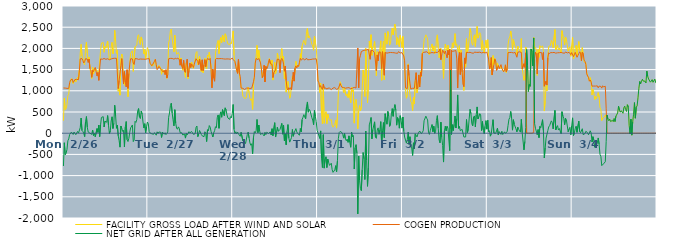
| Category | FACILITY GROSS LOAD AFTER WIND AND SOLAR | COGEN PRODUCTION | NET GRID AFTER ALL GENERATION |
|---|---|---|---|
|  Mon  2/26 | 293 | 1067 | -774 |
|  Mon  2/26 | 829 | 1054 | -225 |
|  Mon  2/26 | 553 | 1064 | -511 |
|  Mon  2/26 | 583 | 1058 | -475 |
|  Mon  2/26 | 675 | 1058 | -383 |
|  Mon  2/26 | 886 | 1065 | -179 |
|  Mon  2/26 | 921 | 1055 | -134 |
|  Mon  2/26 | 1161 | 1193 | -32 |
|  Mon  2/26 | 1233 | 1253 | -20 |
|  Mon  2/26 | 1290 | 1265 | 25 |
|  Mon  2/26 | 1291 | 1274 | 17 |
|  Mon  2/26 | 1166 | 1196 | -30 |
|  Mon  2/26 | 1221 | 1194 | 27 |
|  Mon  2/26 | 1271 | 1263 | 8 |
|  Mon  2/26 | 1206 | 1241 | -35 |
|  Mon  2/26 | 1256 | 1270 | -14 |
|  Mon  2/26 | 1322 | 1280 | 42 |
|  Mon  2/26 | 1264 | 1262 | 2 |
|  Mon  2/26 | 1491 | 1471 | 20 |
|  Mon  2/26 | 1885 | 1754 | 131 |
|  Mon  2/26 | 2095 | 1737 | 358 |
|  Mon  2/26 | 1822 | 1759 | 63 |
|  Mon  2/26 | 1752 | 1713 | 39 |
|  Mon  2/26 | 1651 | 1657 | -6 |
|  Mon  2/26 | 1611 | 1692 | -81 |
|  Mon  2/26 | 2029 | 1757 | 272 |
|  Mon  2/26 | 2147 | 1754 | 393 |
|  Mon  2/26 | 1886 | 1748 | 138 |
|  Mon  2/26 | 1697 | 1670 | 27 |
|  Mon  2/26 | 1792 | 1748 | 44 |
|  Mon  2/26 | 1526 | 1526 | 0 |
|  Mon  2/26 | 1504 | 1499 | 5 |
|  Mon  2/26 | 1290 | 1318 | -28 |
|  Mon  2/26 | 1556 | 1482 | 74 |
|  Mon  2/26 | 1395 | 1451 | -56 |
|  Mon  2/26 | 1519 | 1522 | -3 |
|  Mon  2/26 | 1464 | 1550 | -86 |
|  Mon  2/26 | 1508 | 1571 | -63 |
|  Mon  2/26 | 1461 | 1352 | 109 |
|  Mon  2/26 | 1450 | 1431 | 19 |
|  Mon  2/26 | 1440 | 1247 | 193 |
|  Mon  2/26 | 1450 | 1530 | -80 |
|  Mon  2/26 | 1949 | 1752 | 197 |
|  Mon  2/26 | 2126 | 1754 | 372 |
|  Mon  2/26 | 2113 | 1744 | 369 |
|  Mon  2/26 | 2137 | 1747 | 390 |
|  Mon  2/26 | 1909 | 1762 | 147 |
|  Mon  2/26 | 2046 | 1763 | 283 |
|  Mon  2/26 | 2004 | 1743 | 261 |
|  Mon  2/26 | 2017 | 1758 | 259 |
|  Mon  2/26 | 2172 | 1756 | 416 |
|  Mon  2/26 | 1948 | 1768 | 180 |
|  Mon  2/26 | 1726 | 1733 | -7 |
|  Mon  2/26 | 1775 | 1722 | 53 |
|  Mon  2/26 | 2039 | 1751 | 288 |
|  Mon  2/26 | 2142 | 1755 | 387 |
|  Mon  2/26 | 1875 | 1764 | 111 |
|  Mon  2/26 | 1990 | 1756 | 234 |
|  Mon  2/26 | 2426 | 1767 | 659 |
|  Mon  2/26 | 2166 | 1757 | 409 |
|  Mon  2/26 | 1882 | 1766 | 116 |
|  Mon  2/26 | 1950 | 1762 | 188 |
|  Mon  2/26 | 990 | 1053 | -63 |
|  Mon  2/26 | 1066 | 1244 | -178 |
|  Mon  2/26 | 897 | 1226 | -329 |
|  Mon  2/26 | 1762 | 1592 | 170 |
|  Mon  2/26 | 1868 | 1759 | 109 |
|  Mon  2/26 | 1801 | 1758 | 43 |
|  Mon  2/26 | 1235 | 1168 | 67 |
|  Mon  2/26 | 1130 | 1454 | -324 |
|  Mon  2/26 | 1353 | 1207 | 146 |
|  Mon  2/26 | 1368 | 1093 | 275 |
|  Mon  2/26 | 1343 | 1497 | -154 |
|  Mon  2/26 | 859 | 1056 | -197 |
|  Mon  2/26 | 1288 | 1410 | -122 |
|  Mon  2/26 | 1649 | 1629 | 20 |
|  Mon  2/26 | 1881 | 1756 | 125 |
|  Mon  2/26 | 1888 | 1755 | 133 |
|  Mon  2/26 | 1946 | 1752 | 194 |
|  Mon  2/26 | 1457 | 1655 | -198 |
|  Mon  2/26 | 1463 | 1621 | -158 |
|  Mon  2/26 | 2039 | 1760 | 279 |
|  Mon  2/26 | 2016 | 1762 | 254 |
|  Mon  2/26 | 2078 | 1756 | 322 |
|  Mon  2/26 | 2287 | 1762 | 525 |
|  Mon  2/26 | 2322 | 1741 | 581 |
|  Mon  2/26 | 2149 | 1764 | 385 |
|  Mon  2/26 | 2094 | 1750 | 344 |
|  Mon  2/26 | 2270 | 1746 | 524 |
|  Mon  2/26 | 2197 | 1747 | 450 |
|  Mon  2/26 | 2026 | 1761 | 265 |
|  Mon  2/26 | 1870 | 1746 | 124 |
|  Mon  2/26 | 1971 | 1747 | 224 |
|  Mon  2/26 | 1753 | 1744 | 9 |
|  Mon  2/26 | 1911 | 1758 | 153 |
|  Mon  2/26 | 2020 | 1756 | 264 |
|  Tue  2/27 | 1963 | 1743 | 220 |
|  Tue  2/27 | 1797 | 1759 | 38 |
|  Tue  2/27 | 1654 | 1649 | 5 |
|  Tue  2/27 | 1645 | 1659 | -14 |
|  Tue  2/27 | 1577 | 1591 | -14 |
|  Tue  2/27 | 1626 | 1624 | 2 |
|  Tue  2/27 | 1597 | 1622 | -25 |
|  Tue  2/27 | 1710 | 1697 | 13 |
|  Tue  2/27 | 1745 | 1743 | 2 |
|  Tue  2/27 | 1568 | 1615 | -47 |
|  Tue  2/27 | 1531 | 1498 | 33 |
|  Tue  2/27 | 1521 | 1529 | -8 |
|  Tue  2/27 | 1603 | 1575 | 28 |
|  Tue  2/27 | 1588 | 1564 | 24 |
|  Tue  2/27 | 1541 | 1518 | 23 |
|  Tue  2/27 | 1390 | 1490 | -100 |
|  Tue  2/27 | 1513 | 1487 | 26 |
|  Tue  2/27 | 1454 | 1441 | 13 |
|  Tue  2/27 | 1461 | 1485 | -24 |
|  Tue  2/27 | 1391 | 1382 | 9 |
|  Tue  2/27 | 1464 | 1497 | -33 |
|  Tue  2/27 | 1294 | 1301 | -7 |
|  Tue  2/27 | 1410 | 1379 | 31 |
|  Tue  2/27 | 2130 | 1755 | 375 |
|  Tue  2/27 | 2211 | 1736 | 475 |
|  Tue  2/27 | 2414 | 1764 | 650 |
|  Tue  2/27 | 2456 | 1749 | 707 |
|  Tue  2/27 | 2240 | 1764 | 476 |
|  Tue  2/27 | 2074 | 1755 | 319 |
|  Tue  2/27 | 1919 | 1746 | 173 |
|  Tue  2/27 | 2311 | 1757 | 554 |
|  Tue  2/27 | 2008 | 1770 | 238 |
|  Tue  2/27 | 1864 | 1746 | 118 |
|  Tue  2/27 | 1864 | 1771 | 93 |
|  Tue  2/27 | 1903 | 1754 | 149 |
|  Tue  2/27 | 1862 | 1746 | 116 |
|  Tue  2/27 | 1615 | 1603 | 12 |
|  Tue  2/27 | 1775 | 1743 | 32 |
|  Tue  2/27 | 1585 | 1578 | 7 |
|  Tue  2/27 | 1484 | 1526 | -42 |
|  Tue  2/27 | 1652 | 1717 | -65 |
|  Tue  2/27 | 1435 | 1457 | -22 |
|  Tue  2/27 | 1317 | 1433 | -116 |
|  Tue  2/27 | 1652 | 1658 | -6 |
|  Tue  2/27 | 1706 | 1746 | -40 |
|  Tue  2/27 | 1287 | 1329 | -42 |
|  Tue  2/27 | 1516 | 1480 | 36 |
|  Tue  2/27 | 1660 | 1652 | 8 |
|  Tue  2/27 | 1541 | 1551 | -10 |
|  Tue  2/27 | 1675 | 1635 | 40 |
|  Tue  2/27 | 1609 | 1599 | 10 |
|  Tue  2/27 | 1524 | 1550 | -26 |
|  Tue  2/27 | 1622 | 1629 | -7 |
|  Tue  2/27 | 1636 | 1649 | -13 |
|  Tue  2/27 | 1893 | 1756 | 137 |
|  Tue  2/27 | 1925 | 1756 | 169 |
|  Tue  2/27 | 1611 | 1693 | -82 |
|  Tue  2/27 | 1597 | 1618 | -21 |
|  Tue  2/27 | 1813 | 1749 | 64 |
|  Tue  2/27 | 1821 | 1767 | 54 |
|  Tue  2/27 | 1453 | 1483 | -30 |
|  Tue  2/27 | 1668 | 1731 | -63 |
|  Tue  2/27 | 1427 | 1476 | -49 |
|  Tue  2/27 | 1527 | 1610 | -83 |
|  Tue  2/27 | 1769 | 1735 | 34 |
|  Tue  2/27 | 1570 | 1569 | 1 |
|  Tue  2/27 | 1517 | 1714 | -197 |
|  Tue  2/27 | 1844 | 1761 | 83 |
|  Tue  2/27 | 1812 | 1755 | 57 |
|  Tue  2/27 | 1913 | 1733 | 180 |
|  Tue  2/27 | 1907 | 1764 | 143 |
|  Tue  2/27 | 1557 | 1514 | 43 |
|  Tue  2/27 | 1112 | 1070 | 42 |
|  Tue  2/27 | 1421 | 1510 | -89 |
|  Tue  2/27 | 1311 | 1302 | 9 |
|  Tue  2/27 | 1284 | 1225 | 59 |
|  Tue  2/27 | 1889 | 1736 | 153 |
|  Tue  2/27 | 1892 | 1763 | 129 |
|  Tue  2/27 | 2122 | 1756 | 366 |
|  Tue  2/27 | 2188 | 1757 | 431 |
|  Tue  2/27 | 1877 | 1761 | 116 |
|  Tue  2/27 | 2184 | 1760 | 424 |
|  Tue  2/27 | 2256 | 1752 | 504 |
|  Tue  2/27 | 2136 | 1759 | 377 |
|  Tue  2/27 | 2315 | 1759 | 556 |
|  Tue  2/27 | 2302 | 1753 | 549 |
|  Tue  2/27 | 2153 | 1738 | 415 |
|  Tue  2/27 | 2346 | 1748 | 598 |
|  Tue  2/27 | 2307 | 1757 | 550 |
|  Tue  2/27 | 2183 | 1752 | 431 |
|  Tue  2/27 | 2108 | 1747 | 361 |
|  Tue  2/27 | 2113 | 1750 | 363 |
|  Tue  2/27 | 2085 | 1758 | 327 |
|  Tue  2/27 | 2133 | 1743 | 390 |
|  Tue  2/27 | 2109 | 1746 | 363 |
|  Tue  2/27 | 2239 | 1772 | 467 |
|  Wed  2/28 | 2412 | 1736 | 676 |
|  Wed  2/28 | 1838 | 1745 | 93 |
|  Wed  2/28 | 1680 | 1692 | -12 |
|  Wed  2/28 | 1614 | 1580 | 34 |
|  Wed  2/28 | 1462 | 1479 | -17 |
|  Wed  2/28 | 1436 | 1410 | 26 |
|  Wed  2/28 | 1729 | 1744 | -15 |
|  Wed  2/28 | 1386 | 1424 | -38 |
|  Wed  2/28 | 1261 | 1334 | -73 |
|  Wed  2/28 | 1085 | 1064 | 21 |
|  Wed  2/28 | 1048 | 1050 | -2 |
|  Wed  2/28 | 875 | 1058 | -183 |
|  Wed  2/28 | 877 | 1052 | -175 |
|  Wed  2/28 | 819 | 1029 | -210 |
|  Wed  2/28 | 801 | 1045 | -244 |
|  Wed  2/28 | 839 | 1062 | -223 |
|  Wed  2/28 | 1022 | 1053 | -31 |
|  Wed  2/28 | 1088 | 1064 | 24 |
|  Wed  2/28 | 954 | 1065 | -111 |
|  Wed  2/28 | 825 | 1054 | -229 |
|  Wed  2/28 | 776 | 1061 | -285 |
|  Wed  2/28 | 814 | 1062 | -248 |
|  Wed  2/28 | 561 | 1046 | -485 |
|  Wed  2/28 | 1117 | 1213 | -96 |
|  Wed  2/28 | 1359 | 1321 | 38 |
|  Wed  2/28 | 1663 | 1654 | 9 |
|  Wed  2/28 | 1821 | 1762 | 59 |
|  Wed  2/28 | 2071 | 1747 | 324 |
|  Wed  2/28 | 1747 | 1735 | 12 |
|  Wed  2/28 | 1955 | 1762 | 193 |
|  Wed  2/28 | 1796 | 1751 | 45 |
|  Wed  2/28 | 1627 | 1658 | -31 |
|  Wed  2/28 | 1482 | 1513 | -31 |
|  Wed  2/28 | 1312 | 1311 | 1 |
|  Wed  2/28 | 1326 | 1361 | -35 |
|  Wed  2/28 | 1538 | 1603 | -65 |
|  Wed  2/28 | 1230 | 1208 | 22 |
|  Wed  2/28 | 1540 | 1575 | -35 |
|  Wed  2/28 | 1540 | 1518 | 22 |
|  Wed  2/28 | 1597 | 1564 | 33 |
|  Wed  2/28 | 1667 | 1675 | -8 |
|  Wed  2/28 | 1759 | 1746 | 13 |
|  Wed  2/28 | 1674 | 1643 | 31 |
|  Wed  2/28 | 1590 | 1632 | -42 |
|  Wed  2/28 | 1727 | 1621 | 106 |
|  Wed  2/28 | 1253 | 1312 | -59 |
|  Wed  2/28 | 1390 | 1428 | -38 |
|  Wed  2/28 | 1675 | 1428 | 247 |
|  Wed  2/28 | 1406 | 1496 | -90 |
|  Wed  2/28 | 1501 | 1474 | 27 |
|  Wed  2/28 | 1890 | 1748 | 142 |
|  Wed  2/28 | 1792 | 1748 | 44 |
|  Wed  2/28 | 1771 | 1738 | 33 |
|  Wed  2/28 | 1517 | 1429 | 88 |
|  Wed  2/28 | 1822 | 1723 | 99 |
|  Wed  2/28 | 1994 | 1763 | 231 |
|  Wed  2/28 | 1707 | 1730 | -23 |
|  Wed  2/28 | 1818 | 1628 | 190 |
|  Wed  2/28 | 1282 | 1462 | -180 |
|  Wed  2/28 | 1572 | 1585 | -13 |
|  Wed  2/28 | 968 | 1241 | -273 |
|  Wed  2/28 | 1104 | 1062 | 42 |
|  Wed  2/28 | 1221 | 1018 | 203 |
|  Wed  2/28 | 959 | 1075 | -116 |
|  Wed  2/28 | 824 | 1035 | -211 |
|  Wed  2/28 | 915 | 1073 | -158 |
|  Wed  2/28 | 920 | 1023 | -103 |
|  Wed  2/28 | 1350 | 1262 | 88 |
|  Wed  2/28 | 1364 | 1437 | -73 |
|  Wed  2/28 | 1237 | 1228 | 9 |
|  Wed  2/28 | 1542 | 1537 | 5 |
|  Wed  2/28 | 1696 | 1588 | 108 |
|  Wed  2/28 | 1568 | 1539 | 29 |
|  Wed  2/28 | 1593 | 1601 | -8 |
|  Wed  2/28 | 1567 | 1575 | -8 |
|  Wed  2/28 | 1623 | 1670 | -47 |
|  Wed  2/28 | 1876 | 1765 | 111 |
|  Wed  2/28 | 1755 | 1724 | 31 |
|  Wed  2/28 | 2061 | 1741 | 320 |
|  Wed  2/28 | 2137 | 1762 | 375 |
|  Wed  2/28 | 2191 | 1753 | 438 |
|  Wed  2/28 | 2109 | 1725 | 384 |
|  Wed  2/28 | 2083 | 1743 | 340 |
|  Wed  2/28 | 2399 | 1769 | 630 |
|  Wed  2/28 | 2469 | 1732 | 737 |
|  Wed  2/28 | 2245 | 1750 | 495 |
|  Wed  2/28 | 2294 | 1734 | 560 |
|  Wed  2/28 | 2271 | 1739 | 532 |
|  Wed  2/28 | 2190 | 1739 | 451 |
|  Wed  2/28 | 2095 | 1729 | 366 |
|  Wed  2/28 | 2060 | 1749 | 311 |
|  Wed  2/28 | 1957 | 1757 | 200 |
|  Wed  2/28 | 2287 | 1751 | 536 |
|  Wed  2/28 | 2140 | 1744 | 396 |
|  Wed  2/28 | 2029 | 1755 | 274 |
|  Wed  2/28 | 1669 | 1607 | 62 |
|  Thu  3/1 | 1238 | 1230 | 8 |
|  Thu  3/1 | 1203 | 1190 | 13 |
|  Thu  3/1 | 961 | 1084 | -123 |
|  Thu  3/1 | 1177 | 1123 | 54 |
|  Thu  3/1 | 458 | 1057 | -599 |
|  Thu  3/1 | 223 | 1033 | -810 |
|  Thu  3/1 | 1127 | 1161 | -34 |
|  Thu  3/1 | 236 | 1060 | -824 |
|  Thu  3/1 | 448 | 1066 | -618 |
|  Thu  3/1 | 509 | 1065 | -556 |
|  Thu  3/1 | 227 | 1037 | -810 |
|  Thu  3/1 | 452 | 1062 | -610 |
|  Thu  3/1 | 368 | 1058 | -690 |
|  Thu  3/1 | 304 | 1063 | -759 |
|  Thu  3/1 | 300 | 1065 | -765 |
|  Thu  3/1 | 320 | 1028 | -708 |
|  Thu  3/1 | 187 | 1047 | -860 |
|  Thu  3/1 | 142 | 1065 | -923 |
|  Thu  3/1 | 127 | 1060 | -933 |
|  Thu  3/1 | 210 | 1076 | -866 |
|  Thu  3/1 | 303 | 1069 | -766 |
|  Thu  3/1 | 121 | 1035 | -914 |
|  Thu  3/1 | 397 | 1043 | -646 |
|  Thu  3/1 | 926 | 1052 | -126 |
|  Thu  3/1 | 1081 | 1064 | 17 |
|  Thu  3/1 | 1214 | 1173 | 41 |
|  Thu  3/1 | 1170 | 1119 | 51 |
|  Thu  3/1 | 1101 | 1085 | 16 |
|  Thu  3/1 | 1055 | 1084 | -29 |
|  Thu  3/1 | 960 | 1076 | -116 |
|  Thu  3/1 | 1075 | 1082 | -7 |
|  Thu  3/1 | 930 | 1061 | -131 |
|  Thu  3/1 | 876 | 1054 | -178 |
|  Thu  3/1 | 930 | 1070 | -140 |
|  Thu  3/1 | 839 | 1055 | -216 |
|  Thu  3/1 | 1012 | 1075 | -63 |
|  Thu  3/1 | 839 | 1057 | -218 |
|  Thu  3/1 | 716 | 1048 | -332 |
|  Thu  3/1 | 1088 | 1069 | 19 |
|  Thu  3/1 | 979 | 1062 | -83 |
|  Thu  3/1 | 1023 | 1077 | -54 |
|  Thu  3/1 | 237 | 1081 | -844 |
|  Thu  3/1 | 716 | 1063 | -347 |
|  Thu  3/1 | 795 | 1065 | -270 |
|  Thu  3/1 | 598 | 1067 | -469 |
|  Thu  3/1 | 106 | 2010 | -1904 |
|  Thu  3/1 | 531 | 1069 | -538 |
|  Thu  3/1 | 650 | 1759 | -1109 |
|  Thu  3/1 | 529 | 1835 | -1306 |
|  Thu  3/1 | 571 | 1925 | -1354 |
|  Thu  3/1 | 1068 | 1929 | -861 |
|  Thu  3/1 | 1491 | 1947 | -456 |
|  Thu  3/1 | 1336 | 1940 | -604 |
|  Thu  3/1 | 865 | 1958 | -1093 |
|  Thu  3/1 | 1999 | 1948 | 51 |
|  Thu  3/1 | 1323 | 1964 | -641 |
|  Thu  3/1 | 717 | 1970 | -1253 |
|  Thu  3/1 | 1156 | 1977 | -821 |
|  Thu  3/1 | 2171 | 1975 | 196 |
|  Thu  3/1 | 2012 | 1743 | 269 |
|  Thu  3/1 | 2323 | 1953 | 370 |
|  Thu  3/1 | 1835 | 1967 | -132 |
|  Thu  3/1 | 2036 | 1951 | 85 |
|  Thu  3/1 | 2066 | 1963 | 103 |
|  Thu  3/1 | 2165 | 1897 | 268 |
|  Thu  3/1 | 1787 | 1883 | -96 |
|  Thu  3/1 | 1353 | 1474 | -121 |
|  Thu  3/1 | 1921 | 1846 | 75 |
|  Thu  3/1 | 1834 | 1708 | 126 |
|  Thu  3/1 | 1892 | 1918 | -26 |
|  Thu  3/1 | 1979 | 1904 | 75 |
|  Thu  3/1 | 2180 | 1907 | 273 |
|  Thu  3/1 | 1248 | 1523 | -275 |
|  Thu  3/1 | 1976 | 1921 | 55 |
|  Thu  3/1 | 2169 | 1918 | 251 |
|  Thu  3/1 | 1264 | 1368 | -104 |
|  Thu  3/1 | 2365 | 1906 | 459 |
|  Thu  3/1 | 2231 | 1914 | 317 |
|  Thu  3/1 | 2100 | 1888 | 212 |
|  Thu  3/1 | 2398 | 1885 | 513 |
|  Thu  3/1 | 2295 | 1898 | 397 |
|  Thu  3/1 | 2075 | 1914 | 161 |
|  Thu  3/1 | 2120 | 1904 | 216 |
|  Thu  3/1 | 2343 | 1888 | 455 |
|  Thu  3/1 | 2481 | 1901 | 580 |
|  Thu  3/1 | 2320 | 1922 | 398 |
|  Thu  3/1 | 2472 | 1898 | 574 |
|  Thu  3/1 | 2573 | 1898 | 675 |
|  Thu  3/1 | 2433 | 1889 | 544 |
|  Thu  3/1 | 2082 | 1893 | 189 |
|  Thu  3/1 | 2252 | 1884 | 368 |
|  Thu  3/1 | 2236 | 1923 | 313 |
|  Thu  3/1 | 2040 | 1922 | 118 |
|  Thu  3/1 | 2306 | 1894 | 412 |
|  Thu  3/1 | 2205 | 1887 | 318 |
|  Thu  3/1 | 2019 | 1899 | 120 |
|  Fri  3/2 | 2282 | 1900 | 382 |
|  Fri  3/2 | 1878 | 1823 | 55 |
|  Fri  3/2 | 1616 | 1707 | -91 |
|  Fri  3/2 | 983 | 1069 | -86 |
|  Fri  3/2 | 825 | 1060 | -235 |
|  Fri  3/2 | 898 | 1054 | -156 |
|  Fri  3/2 | 1635 | 1612 | 23 |
|  Fri  3/2 | 1097 | 1359 | -262 |
|  Fri  3/2 | 1097 | 1180 | -83 |
|  Fri  3/2 | 741 | 1040 | -299 |
|  Fri  3/2 | 716 | 1062 | -346 |
|  Fri  3/2 | 535 | 1060 | -525 |
|  Fri  3/2 | 842 | 1069 | -227 |
|  Fri  3/2 | 693 | 1058 | -365 |
|  Fri  3/2 | 1225 | 1238 | -13 |
|  Fri  3/2 | 1405 | 1428 | -23 |
|  Fri  3/2 | 952 | 1040 | -88 |
|  Fri  3/2 | 1063 | 1081 | -18 |
|  Fri  3/2 | 1337 | 1374 | -37 |
|  Fri  3/2 | 1142 | 1090 | 52 |
|  Fri  3/2 | 1468 | 1432 | 36 |
|  Fri  3/2 | 1335 | 1347 | -12 |
|  Fri  3/2 | 1888 | 1880 | 8 |
|  Fri  3/2 | 1959 | 1904 | 55 |
|  Fri  3/2 | 2200 | 1906 | 294 |
|  Fri  3/2 | 2193 | 1912 | 281 |
|  Fri  3/2 | 2320 | 1919 | 401 |
|  Fri  3/2 | 2273 | 1921 | 352 |
|  Fri  3/2 | 2227 | 1914 | 313 |
|  Fri  3/2 | 1915 | 1886 | 29 |
|  Fri  3/2 | 1848 | 1876 | -28 |
|  Fri  3/2 | 1951 | 1892 | 59 |
|  Fri  3/2 | 1956 | 1884 | 72 |
|  Fri  3/2 | 2105 | 1902 | 203 |
|  Fri  3/2 | 1942 | 1907 | 35 |
|  Fri  3/2 | 2058 | 1895 | 163 |
|  Fri  3/2 | 1877 | 1881 | -4 |
|  Fri  3/2 | 1938 | 1906 | 32 |
|  Fri  3/2 | 2223 | 1920 | 303 |
|  Fri  3/2 | 2319 | 1905 | 414 |
|  Fri  3/2 | 2014 | 1896 | 118 |
|  Fri  3/2 | 1781 | 1939 | -158 |
|  Fri  3/2 | 1763 | 1990 | -227 |
|  Fri  3/2 | 1996 | 1736 | 260 |
|  Fri  3/2 | 1757 | 1857 | -100 |
|  Fri  3/2 | 1668 | 1960 | -292 |
|  Fri  3/2 | 1294 | 1975 | -681 |
|  Fri  3/2 | 1933 | 1876 | 57 |
|  Fri  3/2 | 2104 | 1939 | 165 |
|  Fri  3/2 | 2001 | 1945 | 56 |
|  Fri  3/2 | 1942 | 1779 | 163 |
|  Fri  3/2 | 2077 | 1959 | 118 |
|  Fri  3/2 | 1961 | 1844 | 117 |
|  Fri  3/2 | 1567 | 1978 | -411 |
|  Fri  3/2 | 1597 | 114 | 1483 |
|  Fri  3/2 | 1930 | 1959 | -29 |
|  Fri  3/2 | 2130 | 1929 | 201 |
|  Fri  3/2 | 2010 | 1948 | 62 |
|  Fri  3/2 | 2149 | 1939 | 210 |
|  Fri  3/2 | 2349 | 1943 | 406 |
|  Fri  3/2 | 2071 | 1949 | 122 |
|  Fri  3/2 | 2099 | 1750 | 349 |
|  Fri  3/2 | 1968 | 1065 | 903 |
|  Fri  3/2 | 1902 | 1787 | 115 |
|  Fri  3/2 | 2063 | 1906 | 157 |
|  Fri  3/2 | 1440 | 1383 | 57 |
|  Fri  3/2 | 1958 | 1898 | 60 |
|  Fri  3/2 | 1538 | 1446 | 92 |
|  Fri  3/2 | 1259 | 1160 | 99 |
|  Fri  3/2 | 1009 | 1098 | -89 |
|  Fri  3/2 | 1696 | 1775 | -79 |
|  Fri  3/2 | 1558 | 1647 | -89 |
|  Fri  3/2 | 2231 | 1908 | 323 |
|  Fri  3/2 | 1912 | 1898 | 14 |
|  Fri  3/2 | 1995 | 1901 | 94 |
|  Fri  3/2 | 2231 | 1895 | 336 |
|  Fri  3/2 | 2470 | 1908 | 562 |
|  Fri  3/2 | 2380 | 1919 | 461 |
|  Fri  3/2 | 2116 | 1892 | 224 |
|  Fri  3/2 | 2074 | 1900 | 174 |
|  Fri  3/2 | 2266 | 1885 | 381 |
|  Fri  3/2 | 2320 | 1913 | 407 |
|  Fri  3/2 | 2044 | 1897 | 147 |
|  Fri  3/2 | 2341 | 1906 | 435 |
|  Fri  3/2 | 2519 | 1899 | 620 |
|  Fri  3/2 | 2243 | 1906 | 337 |
|  Fri  3/2 | 2304 | 1917 | 387 |
|  Fri  3/2 | 2371 | 1910 | 461 |
|  Fri  3/2 | 2328 | 1896 | 432 |
|  Fri  3/2 | 1958 | 1894 | 64 |
|  Fri  3/2 | 2182 | 1905 | 277 |
|  Fri  3/2 | 1978 | 1904 | 74 |
|  Fri  3/2 | 1890 | 1900 | -10 |
|  Fri  3/2 | 2056 | 1894 | 162 |
|  Fri  3/2 | 2194 | 1898 | 296 |
|  Fri  3/2 | 2007 | 1911 | 96 |
|  Sat  3/3 | 2205 | 1899 | 306 |
|  Sat  3/3 | 1783 | 1748 | 35 |
|  Sat  3/3 | 1571 | 1512 | 59 |
|  Sat  3/3 | 1524 | 1594 | -70 |
|  Sat  3/3 | 1773 | 1784 | -11 |
|  Sat  3/3 | 1371 | 1377 | -6 |
|  Sat  3/3 | 1830 | 1511 | 319 |
|  Sat  3/3 | 1623 | 1620 | 3 |
|  Sat  3/3 | 1762 | 1753 | 9 |
|  Sat  3/3 | 1699 | 1704 | -5 |
|  Sat  3/3 | 1496 | 1482 | 14 |
|  Sat  3/3 | 1657 | 1537 | 120 |
|  Sat  3/3 | 1556 | 1598 | -42 |
|  Sat  3/3 | 1559 | 1524 | 35 |
|  Sat  3/3 | 1517 | 1508 | 9 |
|  Sat  3/3 | 1590 | 1617 | -27 |
|  Sat  3/3 | 1572 | 1526 | 46 |
|  Sat  3/3 | 1486 | 1517 | -31 |
|  Sat  3/3 | 1446 | 1450 | -4 |
|  Sat  3/3 | 1512 | 1480 | 32 |
|  Sat  3/3 | 1611 | 1612 | -1 |
|  Sat  3/3 | 1432 | 1452 | -20 |
|  Sat  3/3 | 1542 | 1507 | 35 |
|  Sat  3/3 | 2084 | 1900 | 184 |
|  Sat  3/3 | 2226 | 1898 | 328 |
|  Sat  3/3 | 2270 | 1903 | 367 |
|  Sat  3/3 | 2411 | 1898 | 513 |
|  Sat  3/3 | 2263 | 1905 | 358 |
|  Sat  3/3 | 1956 | 1884 | 72 |
|  Sat  3/3 | 2211 | 1893 | 318 |
|  Sat  3/3 | 2109 | 1898 | 211 |
|  Sat  3/3 | 2121 | 1905 | 216 |
|  Sat  3/3 | 1997 | 1896 | 101 |
|  Sat  3/3 | 1823 | 1791 | 32 |
|  Sat  3/3 | 2052 | 1909 | 143 |
|  Sat  3/3 | 1994 | 1903 | 91 |
|  Sat  3/3 | 1971 | 1920 | 51 |
|  Sat  3/3 | 1921 | 1897 | 24 |
|  Sat  3/3 | 2232 | 1905 | 327 |
|  Sat  3/3 | 1527 | 1516 | 11 |
|  Sat  3/3 | 1548 | 1531 | 17 |
|  Sat  3/3 | 1247 | 1640 | -393 |
|  Sat  3/3 | 1358 | 1552 | -194 |
|  Sat  3/3 | 2031 | 1895 | 136 |
|  Sat  3/3 | 1973 | 0 | 1973 |
|  Sat  3/3 | 1606 | 0 | 1606 |
|  Sat  3/3 | 984 | 0 | 984 |
|  Sat  3/3 | 1151 | 0 | 1151 |
|  Sat  3/3 | 1105 | 0 | 1105 |
|  Sat  3/3 | 1987 | 0 | 1987 |
|  Sat  3/3 | 1930 | 0 | 1930 |
|  Sat  3/3 | 1588 | 0 | 1588 |
|  Sat  3/3 | 2260 | 13 | 2247 |
|  Sat  3/3 | 2000 | 1769 | 231 |
|  Sat  3/3 | 2027 | 1910 | 117 |
|  Sat  3/3 | 1952 | 1852 | 100 |
|  Sat  3/3 | 1362 | 1397 | -35 |
|  Sat  3/3 | 1972 | 1887 | 85 |
|  Sat  3/3 | 1790 | 1894 | -104 |
|  Sat  3/3 | 2064 | 1902 | 162 |
|  Sat  3/3 | 2022 | 1895 | 127 |
|  Sat  3/3 | 2016 | 1900 | 116 |
|  Sat  3/3 | 2057 | 1738 | 319 |
|  Sat  3/3 | 1959 | 1902 | 57 |
|  Sat  3/3 | 523 | 1108 | -585 |
|  Sat  3/3 | 755 | 1103 | -348 |
|  Sat  3/3 | 1114 | 1229 | -115 |
|  Sat  3/3 | 1002 | 1135 | -133 |
|  Sat  3/3 | 1841 | 1779 | 62 |
|  Sat  3/3 | 2046 | 1898 | 148 |
|  Sat  3/3 | 2051 | 1874 | 177 |
|  Sat  3/3 | 2071 | 1902 | 169 |
|  Sat  3/3 | 2190 | 1899 | 291 |
|  Sat  3/3 | 2150 | 1899 | 251 |
|  Sat  3/3 | 2016 | 1913 | 103 |
|  Sat  3/3 | 2018 | 1905 | 113 |
|  Sat  3/3 | 2442 | 1906 | 536 |
|  Sat  3/3 | 1965 | 1888 | 77 |
|  Sat  3/3 | 2028 | 1882 | 146 |
|  Sat  3/3 | 2075 | 1897 | 178 |
|  Sat  3/3 | 1967 | 1893 | 74 |
|  Sat  3/3 | 2010 | 1899 | 111 |
|  Sat  3/3 | 2009 | 1886 | 123 |
|  Sat  3/3 | 1894 | 1905 | -11 |
|  Sat  3/3 | 2418 | 1911 | 507 |
|  Sat  3/3 | 2299 | 1892 | 407 |
|  Sat  3/3 | 2241 | 1887 | 354 |
|  Sat  3/3 | 2086 | 1886 | 200 |
|  Sat  3/3 | 2270 | 1916 | 354 |
|  Sat  3/3 | 2211 | 1900 | 311 |
|  Sat  3/3 | 2191 | 1892 | 299 |
|  Sat  3/3 | 1935 | 1902 | 33 |
|  Sat  3/3 | 2005 | 1909 | 96 |
|  Sat  3/3 | 2038 | 1899 | 139 |
|  Sat  3/3 | 1815 | 1853 | -38 |
|  Sat  3/3 | 2072 | 1902 | 170 |
|  Sun  3/4 | 2257 | 1895 | 362 |
|  Sun  3/4 | 1750 | 1806 | -56 |
|  Sun  3/4 | 1818 | 1811 | 7 |
|  Sun  3/4 | 2014 | 1907 | 107 |
|  Sun  3/4 | 2068 | 1906 | 162 |
|  Sun  3/4 | 1812 | 1791 | 21 |
|  Sun  3/4 | 1834 | 1832 | 2 |
|  Sun  3/4 | 2160 | 1876 | 284 |
|  Sun  3/4 | 1955 | 1919 | 36 |
|  Sun  3/4 | 1906 | 1895 | 11 |
|  Sun  3/4 | 1708 | 1710 | -2 |
|  Sun  3/4 | 2017 | 1911 | 106 |
|  Sun  3/4 | 1852 | 1887 | -35 |
|  Sun  3/4 | 1680 | 1724 | -44 |
|  Sun  3/4 | 1687 | 1696 | -9 |
|  Sun  3/4 | 1667 | 1623 | 44 |
|  Sun  3/4 | 1435 | 1399 | 36 |
|  Sun  3/4 | 1360 | 1349 | 11 |
|  Sun  3/4 | 1283 | 1320 | -37 |
|  Sun  3/4 | 1229 | 1226 | 3 |
|  Sun  3/4 | 1312 | 1256 | 56 |
|  Sun  3/4 | 1209 | 1206 | 3 |
|  Sun  3/4 | 901 | 1109 | -208 |
|  Sun  3/4 | 1034 | 1116 | -82 |
|  Sun  3/4 | 950 | 1112 | -162 |
|  Sun  3/4 | 793 | 1124 | -331 |
|  Sun  3/4 | 869 | 1111 | -242 |
|  Sun  3/4 | 811 | 1098 | -287 |
|  Sun  3/4 | 888 | 1117 | -229 |
|  Sun  3/4 | 958 | 1070 | -112 |
|  Sun  3/4 | 854 | 1110 | -256 |
|  Sun  3/4 | 606 | 1106 | -500 |
|  Sun  3/4 | 560 | 1103 | -543 |
|  Sun  3/4 | 298 | 1063 | -765 |
|  Sun  3/4 | 353 | 1119 | -766 |
|  Sun  3/4 | 370 | 1092 | -722 |
|  Sun  3/4 | 379 | 1105 | -726 |
|  Sun  3/4 | 434 | 1107 | -673 |
|  Sun  3/4 | 381 | 575 | -194 |
|  Sun  3/4 | 428 | 0 | 428 |
|  Sun  3/4 | 333 | 0 | 333 |
|  Sun  3/4 | 294 | 0 | 294 |
|  Sun  3/4 | 331 | 0 | 331 |
|  Sun  3/4 | 275 | 0 | 275 |
|  Sun  3/4 | 292 | 0 | 292 |
|  Sun  3/4 | 303 | 0 | 303 |
|  Sun  3/4 | 273 | 0 | 273 |
|  Sun  3/4 | 349 | 0 | 349 |
|  Sun  3/4 | 274 | 0 | 274 |
|  Sun  3/4 | 401 | 0 | 401 |
|  Sun  3/4 | 416 | 0 | 416 |
|  Sun  3/4 | 478 | 0 | 478 |
|  Sun  3/4 | 635 | 0 | 635 |
|  Sun  3/4 | 542 | 0 | 542 |
|  Sun  3/4 | 496 | 0 | 496 |
|  Sun  3/4 | 531 | 0 | 531 |
|  Sun  3/4 | 523 | 0 | 523 |
|  Sun  3/4 | 470 | 0 | 470 |
|  Sun  3/4 | 599 | 0 | 599 |
|  Sun  3/4 | 638 | 0 | 638 |
|  Sun  3/4 | 558 | 0 | 558 |
|  Sun  3/4 | 514 | 0 | 514 |
|  Sun  3/4 | 672 | 0 | 672 |
|  Sun  3/4 | 621 | 0 | 621 |
|  Sun  3/4 | 189 | 0 | 189 |
|  Sun  3/4 | -17 | 0 | -17 |
|  Sun  3/4 | 330 | 0 | 330 |
|  Sun  3/4 | -46 | 0 | -46 |
|  Sun  3/4 | 270 | 0 | 270 |
|  Sun  3/4 | 448 | 0 | 448 |
|  Sun  3/4 | 721 | 0 | 721 |
|  Sun  3/4 | 354 | 0 | 354 |
|  Sun  3/4 | 614 | 0 | 614 |
|  Sun  3/4 | 644 | 0 | 644 |
|  Sun  3/4 | 835 | 0 | 835 |
|  Sun  3/4 | 1060 | 0 | 1060 |
|  Sun  3/4 | 1219 | 0 | 1219 |
|  Sun  3/4 | 1163 | 0 | 1163 |
|  Sun  3/4 | 1228 | 0 | 1228 |
|  Sun  3/4 | 1272 | 0 | 1272 |
|  Sun  3/4 | 1228 | 0 | 1228 |
|  Sun  3/4 | 1240 | 0 | 1240 |
|  Sun  3/4 | 1227 | 0 | 1227 |
|  Sun  3/4 | 1184 | 0 | 1184 |
|  Sun  3/4 | 1465 | 0 | 1465 |
|  Sun  3/4 | 1338 | 0 | 1338 |
|  Sun  3/4 | 1279 | 0 | 1279 |
|  Sun  3/4 | 1280 | 0 | 1280 |
|  Sun  3/4 | 1204 | 0 | 1204 |
|  Sun  3/4 | 1228 | 0 | 1228 |
|  Sun  3/4 | 1263 | 0 | 1263 |
|  Sun  3/4 | 1201 | 0 | 1201 |
|  Sun  3/4 | 1191 | 0 | 1191 |
|  Sun  3/4 | 1275 | 0 | 1275 |
|  Sun  3/4 | 1197 | 0 | 1197 |
|  Sun  3/4 | 1169 | 0 | 1169 |